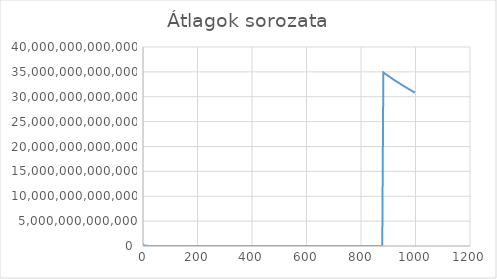
| Category | Series 0 |
|---|---|
| 1.0 | 19724846819.907 |
| 2.0 | 229930537430.604 |
| 3.0 | 153565868804.437 |
| 4.0 | 115174401613.328 |
| 5.0 | 92139521290.983 |
| 6.0 | 76782944685.442 |
| 7.0 | 65813952588.064 |
| 8.0 | 57587208521.358 |
| 9.0 | 51188629797.027 |
| 10.0 | 46069766818.082 |
| 11.0 | 41881607259.74 |
| 12.0 | 38391473335.248 |
| 13.0 | 35438283161.898 |
| 14.0 | 32906981036.695 |
| 15.0 | 30713182416.195 |
| 16.0 | 28794187320.283 |
| 17.0 | 27100411596.561 |
| 18.0 | 25594857300.366 |
| 19.0 | 24247759552.774 |
| 20.0 | 23035371575.427 |
| 21.0 | 21938449208.439 |
| 22.0 | 20941246972.965 |
| 23.0 | 20030758002.763 |
| 24.0 | 19196143098.01 |
| 25.0 | 18428297374.164 |
| 26.0 | 17719516705.983 |
| 27.0 | 17063238620.04 |
| 28.0 | 16453837242.734 |
| 29.0 | 15886463544.755 |
| 30.0 | 15356914764.224 |
| 31.0 | 14861530538.324 |
| 32.0 | 14397107709.798 |
| 33.0 | 13960875382.173 |
| 34.0 | 13550261410.743 |
| 35.0 | 13163111659.04 |
| 36.0 | 12797469668.547 |
| 37.0 | 12451592110.085 |
| 38.0 | 12123918633.544 |
| 39.0 | 11813048925.401 |
| 40.0 | 11517723842.822 |
| 41.0 | 11236803749.482 |
| 42.0 | 10969260803.286 |
| 43.0 | 10714161714.869 |
| 44.0 | 10470658160.061 |
| 45.0 | 10237976868.073 |
| 46.0 | 10015412171.199 |
| 47.0 | 9802318295.325 |
| 48.0 | 9598103330.966 |
| 49.0 | 9402223671.187 |
| 50.0 | 9216576213.076 |
| 51.0 | 9035859033.383 |
| 52.0 | 8862092516.917 |
| 53.0 | 8694883226.015 |
| 54.0 | 8533866870.097 |
| 55.0 | 8378705661.365 |
| 56.0 | 8229085917.439 |
| 57.0 | 8084716124.878 |
| 58.0 | 7945324467.596 |
| 59.0 | 7810657952.505 |
| 60.0 | 7680480320.06 |
| 61.0 | 7554570808.469 |
| 62.0 | 7432722892.471 |
| 63.0 | 7314743165.586 |
| 64.0 | 7200450303.652 |
| 65.0 | 7089674145.155 |
| 66.0 | 6982255321.059 |
| 67.0 | 6878042555.107 |
| 68.0 | 6776894877.341 |
| 69.0 | 6678679009.64 |
| 70.0 | 6583269309.573 |
| 71.0 | 6490547207.248 |
| 72.0 | 6400400718.279 |
| 73.0 | 6312723996.131 |
| 74.0 | 6227416917.142 |
| 75.0 | 6144384691.624 |
| 76.0 | 6063750202.091 |
| 77.0 | 5985000200.344 |
| 78.0 | 5908269471.07 |
| 79.0 | 5833481249.947 |
| 80.0 | 5760562734.355 |
| 81.0 | 5691732467.257 |
| 82.0 | 5622331978.803 |
| 83.0 | 5554593039.332 |
| 84.0 | 5488466935.043 |
| 85.0 | 5423896735.823 |
| 86.0 | 5360849330.842 |
| 87.0 | 5299230373.317 |
| 88.0 | 5239011850.4 |
| 89.0 | 5180148224.68 |
| 90.0 | 5122591152.175 |
| 91.0 | 5066298944.329 |
| 92.0 | 5011230477.655 |
| 93.0 | 4957346278.982 |
| 94.0 | 4904608552.701 |
| 95.0 | 4852982028.098 |
| 96.0 | 4802438501.838 |
| 97.0 | 4752928826.655 |
| 98.0 | 4704429555.519 |
| 99.0 | 4656910065.316 |
| 100.0 | 4610340964.787 |
| 101.0 | 4564694024.573 |
| 102.0 | 4519942125.119 |
| 103.0 | 4476059277.794 |
| 104.0 | 4433096106.19 |
| 105.0 | 4390876143.321 |
| 106.0 | 4349452783.594 |
| 107.0 | 4308803692.174 |
| 108.0 | 4268907361.705 |
| 109.0 | 4229743082.653 |
| 110.0 | 4191290895.528 |
| 111.0 | 4153577433.517 |
| 112.0 | 4116491955.772 |
| 113.0 | 4080062823.588 |
| 114.0 | 4044272798.852 |
| 115.0 | 4009105210.274 |
| 116.0 | 3974543958.528 |
| 117.0 | 3940573497.397 |
| 118.0 | 3907178808.82 |
| 119.0 | 3874345373.477 |
| 120.0 | 3842059162.263 |
| 121.0 | 3810306607.286 |
| 122.0 | 3779074586.481 |
| 123.0 | 3748350403.057 |
| 124.0 | 3718121781.241 |
| 125.0 | 3688376807.257 |
| 126.0 | 3659103975.643 |
| 127.0 | 3630292136.177 |
| 128.0 | 3601930478.9 |
| 129.0 | 3574008537.272 |
| 130.0 | 3546516164.117 |
| 131.0 | 3519443521.792 |
| 132.0 | 3492781070.894 |
| 133.0 | 3466519559.325 |
| 134.0 | 3440650845.348 |
| 135.0 | 3415164542.829 |
| 136.0 | 3390053039.271 |
| 137.0 | 3365308362.324 |
| 138.0 | 3341114537.451 |
| 139.0 | 3317077745.63 |
| 140.0 | 3516910248.244 |
| 141.0 | 3491967622.379 |
| 142.0 | 3467376301.104 |
| 143.0 | 3443129526.419 |
| 144.0 | 3419218904.719 |
| 145.0 | 3395638084.756 |
| 146.0 | 3372380290.044 |
| 147.0 | 3349438929.194 |
| 148.0 | 3326807597.508 |
| 149.0 | 3304480030.022 |
| 150.0 | 3282450163.18 |
| 151.0 | 3260712082.721 |
| 152.0 | 3239301927.737 |
| 153.0 | 3218130019.723 |
| 154.0 | 3197236311.782 |
| 155.0 | 3176608980.984 |
| 156.0 | 3156246103.031 |
| 157.0 | 3136142775.728 |
| 158.0 | 3116293771.032 |
| 159.0 | 3096694443.699 |
| 160.0 | 3077340103.442 |
| 161.0 | 3058226189.796 |
| 162.0 | 3039348250.423 |
| 163.0 | 3020738201.701 |
| 164.0 | 3002319066.334 |
| 165.0 | 2984123194.391 |
| 166.0 | 2966146548.661 |
| 167.0 | 2948385192.34 |
| 168.0 | 2930835310.667 |
| 169.0 | 2913495444.99 |
| 170.0 | 2896357236.594 |
| 171.0 | 2879419475.031 |
| 172.0 | 2862678664.136 |
| 173.0 | 2846131388.629 |
| 174.0 | 2829775571.065 |
| 175.0 | 2813605425.064 |
| 176.0 | 2797619031.166 |
| 177.0 | 2781813274.654 |
| 178.0 | 2766185175.168 |
| 179.0 | 2750731631.385 |
| 180.0 | 2735449789.041 |
| 181.0 | 2720337932.336 |
| 182.0 | 2705391022.521 |
| 183.0 | 2690607465.059 |
| 184.0 | 2675985899.465 |
| 185.0 | 2661521113.669 |
| 186.0 | 2647211860.414 |
| 187.0 | 2633055649.556 |
| 188.0 | 2619050034.404 |
| 189.0 | 2605192629.944 |
| 190.0 | 2591481089.796 |
| 191.0 | 2577913125.985 |
| 192.0 | 2564486495.127 |
| 193.0 | 2551199000.343 |
| 194.0 | 2538048491.9 |
| 195.0 | 2525253549.242 |
| 196.0 | 2512369605.198 |
| 197.0 | 2499616460.013 |
| 198.0 | 2486992134.488 |
| 199.0 | 2474494686.912 |
| 200.0 | 2462122213.482 |
| 201.0 | 2449872849.259 |
| 202.0 | 2437744765.911 |
| 203.0 | 2425736171.011 |
| 204.0 | 2413845311.473 |
| 205.0 | 2402070533.396 |
| 206.0 | 2390409997.044 |
| 207.0 | 2378862122.672 |
| 208.0 | 2367425288.873 |
| 209.0 | 2356097895.193 |
| 210.0 | 2344878381.463 |
| 211.0 | 2333765214.353 |
| 212.0 | 2322756887.943 |
| 213.0 | 2311851926.462 |
| 214.0 | 2301048881.47 |
| 215.0 | 2290346354.399 |
| 216.0 | 2279742899.109 |
| 217.0 | 2269237176.736 |
| 218.0 | 2258827838.164 |
| 219.0 | 2248513555.805 |
| 220.0 | 2238293039.814 |
| 221.0 | 2228165017.015 |
| 222.0 | 2218128237.707 |
| 223.0 | 2208181474.314 |
| 224.0 | 2198323521.311 |
| 225.0 | 2188553194.572 |
| 226.0 | 2178869330.891 |
| 227.0 | 2169270787.612 |
| 228.0 | 2159756451.711 |
| 229.0 | 2150325200.85 |
| 230.0 | 2140975960.859 |
| 231.0 | 2131707667.154 |
| 232.0 | 2122519272.088 |
| 233.0 | 2113409783.902 |
| 234.0 | 2104378118.185 |
| 235.0 | 2095423317.688 |
| 236.0 | 2086544405.413 |
| 237.0 | 2077740420.732 |
| 238.0 | 2069010418.969 |
| 239.0 | 2060353471.835 |
| 240.0 | 2051768665.714 |
| 241.0 | 2043255103.573 |
| 242.0 | 2034811900.671 |
| 243.0 | 2026438189.15 |
| 244.0 | 2018134318.277 |
| 245.0 | 2009897036.519 |
| 246.0 | 2001726723.604 |
| 247.0 | 1993622566.924 |
| 248.0 | 1985583766.256 |
| 249.0 | 1977609535.233 |
| 250.0 | 1969699097.148 |
| 251.0 | 1961851690.396 |
| 252.0 | 1954066564.67 |
| 253.0 | 1946342981.418 |
| 254.0 | 1938699261.75 |
| 255.0 | 1931096522.741 |
| 256.0 | 1923553187.091 |
| 257.0 | 1916070279.418 |
| 258.0 | 1908643650.433 |
| 259.0 | 1901274369.945 |
| 260.0 | 1893961860.176 |
| 261.0 | 1886705301.332 |
| 262.0 | 1879504136.152 |
| 263.0 | 1872358773.256 |
| 264.0 | 1865266505.203 |
| 265.0 | 1858227770.225 |
| 266.0 | 1851241951.638 |
| 267.0 | 1844308461.228 |
| 268.0 | 1837426713.457 |
| 269.0 | 1830596130.979 |
| 270.0 | 1823816145.327 |
| 271.0 | 1817086196.516 |
| 272.0 | 2086988729.327 |
| 273.0 | 2079344082.024 |
| 274.0 | 2071755235.365 |
| 275.0 | 2064221580.052 |
| 276.0 | 2056742516.475 |
| 277.0 | 2049317505.013 |
| 278.0 | 2041945859.342 |
| 279.0 | 2034627056.994 |
| 280.0 | 2027360531.811 |
| 281.0 | 2020145725.653 |
| 282.0 | 2012982088.368 |
| 283.0 | 2005869077.46 |
| 284.0 | 1998806158.192 |
| 285.0 | 1991792803.333 |
| 286.0 | 1984828492.846 |
| 287.0 | 1977912714.133 |
| 288.0 | 1971044964.958 |
| 289.0 | 1964224740.189 |
| 290.0 | 1957451553.116 |
| 291.0 | 1950724915.695 |
| 292.0 | 1944044350.92 |
| 293.0 | 19555310328.83 |
| 294.0 | 19488795669.929 |
| 295.0 | 19422731955.823 |
| 296.0 | 19357114618.183 |
| 297.0 | 19291939150.012 |
| 298.0 | 19227201099.921 |
| 299.0 | 19162896079.592 |
| 300.0 | 19099024267.638 |
| 301.0 | 19035572359.804 |
| 302.0 | 18972540663.252 |
| 303.0 | 18909925017.51 |
| 304.0 | 18847721316.798 |
| 305.0 | 18785925509.243 |
| 306.0 | 18724533999.526 |
| 307.0 | 18663542032.125 |
| 308.0 | 18603021089.715 |
| 309.0 | 18542817161.263 |
| 310.0 | 18483001622.103 |
| 311.0 | 18423570748.792 |
| 312.0 | 18364532230.419 |
| 313.0 | 18305859603.491 |
| 314.0 | 18247560687.563 |
| 315.0 | 18189631923.764 |
| 316.0 | 18132070117.846 |
| 317.0 | 18074871158.517 |
| 318.0 | 18018031941.052 |
| 319.0 | 17961549082.333 |
| 320.0 | 17905419241.457 |
| 321.0 | 17849639119.43 |
| 322.0 | 17794205459.597 |
| 323.0 | 17739115079.594 |
| 324.0 | 17684364724.547 |
| 325.0 | 17629951295.157 |
| 326.0 | 17575878628.903 |
| 327.0 | 17522129764.6 |
| 328.0 | 17468708637.402 |
| 329.0 | 17415615296.966 |
| 330.0 | 17362840706.688 |
| 331.0 | 17310384994.59 |
| 332.0 | 17258245359.566 |
| 333.0 | 17206418796.934 |
| 334.0 | 17154902573.147 |
| 335.0 | 17106297209.575 |
| 336.0 | 17055385610.833 |
| 337.0 | 17004776260.281 |
| 338.0 | 16954466271.35 |
| 339.0 | 16904453346.074 |
| 340.0 | 16854734365.663 |
| 341.0 | 16805306992.198 |
| 342.0 | 16756168667.663 |
| 343.0 | 16707316863.97 |
| 344.0 | 16658749082.704 |
| 345.0 | 16610464112.013 |
| 346.0 | 16562456990.314 |
| 347.0 | 16514726566.749 |
| 348.0 | 16467270455.929 |
| 349.0 | 16420086300.035 |
| 350.0 | 16373171767.778 |
| 351.0 | 16326524554.825 |
| 352.0 | 16280142383.065 |
| 353.0 | 16234022999.707 |
| 354.0 | 16188164177.694 |
| 355.0 | 16142563715.226 |
| 356.0 | 16097219435.133 |
| 357.0 | 16052129411.242 |
| 358.0 | 16007291147.459 |
| 359.0 | 15962702593.556 |
| 360.0 | 15918361760.14 |
| 361.0 | 15874281372.937 |
| 362.0 | 15830429766.947 |
| 363.0 | 15786819779.963 |
| 364.0 | 15743449396.873 |
| 365.0 | 15700316658.828 |
| 366.0 | 15657419618.985 |
| 367.0 | 15614756364.656 |
| 368.0 | 15572324963.866 |
| 369.0 | 15530123541.207 |
| 370.0 | 15488150234.344 |
| 371.0 | 15446403203.375 |
| 372.0 | 15404880615.051 |
| 373.0 | 15363580667.574 |
| 374.0 | 15322501952.479 |
| 375.0 | 15281646564.196 |
| 376.0 | 15241003887.168 |
| 377.0 | 15200576821.162 |
| 378.0 | 15160363655.004 |
| 379.0 | 15120362695.532 |
| 380.0 | 15080572267.393 |
| 381.0 | 15040990712.889 |
| 382.0 | 15001616391.683 |
| 383.0 | 14962447680.564 |
| 384.0 | 14923482973.069 |
| 385.0 | 14884720680.425 |
| 386.0 | 14846159227.93 |
| 387.0 | 14807797059.395 |
| 388.0 | 14769632633.988 |
| 389.0 | 14731664506.858 |
| 390.0 | 14693891010.978 |
| 391.0 | 14656310727.069 |
| 392.0 | 14618922179.381 |
| 393.0 | 14581723904.599 |
| 394.0 | 14544714453.358 |
| 395.0 | 14507892391.536 |
| 396.0 | 14471256299.68 |
| 397.0 | 14434804772.483 |
| 398.0 | 14398536420.692 |
| 399.0 | 14362449863.251 |
| 400.0 | 14326544207.03 |
| 401.0 | 14290817164.132 |
| 402.0 | 14255268051.955 |
| 403.0 | 14219895178.403 |
| 404.0 | 14184697418.078 |
| 405.0 | 14149770007.178 |
| 406.0 | 14114920319.176 |
| 407.0 | 14080239925.36 |
| 408.0 | 14045729552.792 |
| 409.0 | 14011387915.746 |
| 410.0 | 13977276010.178 |
| 411.0 | 13943268040.976 |
| 412.0 | 13909425157.387 |
| 413.0 | 13875746161.868 |
| 414.0 | 13842229866.818 |
| 415.0 | 13808875096.383 |
| 416.0 | 13775680685.097 |
| 417.0 | 13742645479.633 |
| 418.0 | 15560488876.191 |
| 419.0 | 15523351671.779 |
| 420.0 | 15486391312.003 |
| 421.0 | 15454145279.882 |
| 422.0 | 15417524082.551 |
| 423.0 | 15381076756.284 |
| 424.0 | 15344800640.47 |
| 425.0 | 15308695227.218 |
| 426.0 | 15272759323.459 |
| 427.0 | 15236991737.244 |
| 428.0 | 15201391289.275 |
| 429.0 | 15165956811.041 |
| 430.0 | 15130687243.088 |
| 431.0 | 15095581240.214 |
| 432.0 | 15060637765.125 |
| 433.0 | 15025855692.03 |
| 434.0 | 14991233906.486 |
| 435.0 | 14957082349.963 |
| 436.0 | 14948785650.013 |
| 437.0 | 14914577902.552 |
| 438.0 | 14880526354.934 |
| 439.0 | 14846629939.567 |
| 440.0 | 14812887599.189 |
| 441.0 | 14779298287.047 |
| 442.0 | 14745860960.618 |
| 443.0 | 14712574592.854 |
| 444.0 | 14679438163.593 |
| 445.0 | 14646450662.124 |
| 446.0 | 14613611087.91 |
| 447.0 | 14580918445.887 |
| 448.0 | 14548371989.73 |
| 449.0 | 14515970270.614 |
| 450.0 | 14483712558.91 |
| 451.0 | 14451597897.254 |
| 452.0 | 14419625338.867 |
| 453.0 | 14387793936.398 |
| 454.0 | 14356102761.137 |
| 455.0 | 14324550888.101 |
| 456.0 | 14293137399.66 |
| 457.0 | 14261861387.87 |
| 458.0 | 14230721952.587 |
| 459.0 | 14199718201.06 |
| 460.0 | 14168849248.452 |
| 461.0 | 14138114217.548 |
| 462.0 | 14107512238.725 |
| 463.0 | 14077042449.912 |
| 464.0 | 14046704044.193 |
| 465.0 | 14016496078.514 |
| 466.0 | 13986435945.469 |
| 467.0 | 13956486404.216 |
| 468.0 | 13926665008.63 |
| 469.0 | 13896970626.953 |
| 470.0 | 13867402604.346 |
| 471.0 | 13837960135.974 |
| 472.0 | 13808654354.128 |
| 473.0 | 13779460607.182 |
| 474.0 | 13750390015.186 |
| 475.0 | 13721441826.933 |
| 476.0 | 13692618285.633 |
| 477.0 | 13663912591.552 |
| 478.0 | 13635327001.123 |
| 479.0 | 13606986477.291 |
| 480.0 | 13578638588.803 |
| 481.0 | 13550408572.477 |
| 482.0 | 13522295691.625 |
| 483.0 | 13494299220.218 |
| 484.0 | 13466418436.72 |
| 485.0 | 13438652625.514 |
| 486.0 | 13411001079.458 |
| 487.0 | 13383463089.565 |
| 488.0 | 13356037960.285 |
| 489.0 | 13328725047.591 |
| 490.0 | 13301523568.056 |
| 491.0 | 13274432888.694 |
| 492.0 | 13247452334.055 |
| 493.0 | 13220581234.027 |
| 494.0 | 13193818923.889 |
| 495.0 | 13167164744.874 |
| 496.0 | 13140618041.767 |
| 497.0 | 13114178172.961 |
| 498.0 | 13087844481.854 |
| 499.0 | 13061616336.603 |
| 500.0 | 13035493104.389 |
| 501.0 | 13009474260.51 |
| 502.0 | 12983558973.143 |
| 503.0 | 12957746728.7 |
| 504.0 | 12932036913.774 |
| 505.0 | 12906428919.888 |
| 506.0 | 12880935490.646 |
| 507.0 | 12855529307.869 |
| 508.0 | 12830223148.382 |
| 509.0 | 12805016423.148 |
| 510.0 | 12779908547.825 |
| 511.0 | 12754898947.598 |
| 512.0 | 12729987054.153 |
| 513.0 | 12705173946.75 |
| 514.0 | 12680455709.885 |
| 515.0 | 12655833466.08 |
| 516.0 | 12631306657.043 |
| 517.0 | 12606874729.284 |
| 518.0 | 12582537133.346 |
| 519.0 | 12558293324.228 |
| 520.0 | 12534142760.145 |
| 521.0 | 12510084904.563 |
| 522.0 | 12486119225.426 |
| 523.0 | 12462245192.496 |
| 524.0 | 12438462281.919 |
| 525.0 | 12414775075.879 |
| 526.0 | 12391172841.971 |
| 527.0 | 12367660180.76 |
| 528.0 | 12344236581.935 |
| 529.0 | 12320901541.212 |
| 530.0 | 12297654557.207 |
| 531.0 | 12274497860.736 |
| 532.0 | 12251425498.784 |
| 533.0 | 12228439710.152 |
| 534.0 | 12205540010.324 |
| 535.0 | 12182725916.849 |
| 536.0 | 12159996950.763 |
| 537.0 | 12137352636.348 |
| 538.0 | 12114792513.452 |
| 539.0 | 12092316094.029 |
| 540.0 | 12069922959.82 |
| 541.0 | 12047612566.284 |
| 542.0 | 12025384498.85 |
| 543.0 | 12003280352.456 |
| 544.0 | 11981215510.074 |
| 545.0 | 11959231628.416 |
| 546.0 | 11937328273.825 |
| 547.0 | 11915506398.588 |
| 548.0 | 11893762787.76 |
| 549.0 | 11872098374.963 |
| 550.0 | 11850512840.801 |
| 551.0 | 11829005575.042 |
| 552.0 | 11807576217.121 |
| 553.0 | 11786224363.12 |
| 554.0 | 11764949589.908 |
| 555.0 | 11743751482.546 |
| 556.0 | 11722629627.381 |
| 557.0 | 11701583613.768 |
| 558.0 | 11729050303.293 |
| 559.0 | 11708068102.425 |
| 560.0 | 11687160842.163 |
| 561.0 | 11666328113.392 |
| 562.0 | 11645569522.528 |
| 563.0 | 11624884985.942 |
| 564.0 | 11604273487.811 |
| 565.0 | 11583734951.59 |
| 566.0 | 11563268988.782 |
| 567.0 | 11542875216.318 |
| 568.0 | 11522553253.048 |
| 569.0 | 11502302720.092 |
| 570.0 | 11482123254.08 |
| 571.0 | 11462014456.802 |
| 572.0 | 11441975969.995 |
| 573.0 | 11422007425.629 |
| 574.0 | 11402108458.613 |
| 575.0 | 11382278706.831 |
| 576.0 | 11362517808.376 |
| 577.0 | 11342825405.134 |
| 578.0 | 11323201139.731 |
| 579.0 | 11303644661.097 |
| 580.0 | 11284155656.618 |
| 581.0 | 11264733706.002 |
| 582.0 | 11245378493.461 |
| 583.0 | 11226089681.124 |
| 584.0 | 11206866925.326 |
| 585.0 | 11187709898.749 |
| 586.0 | 11168618253.115 |
| 587.0 | 11149591646.22 |
| 588.0 | 11130629755.699 |
| 589.0 | 11111732252.096 |
| 590.0 | 11092898807.61 |
| 591.0 | 11074129097.283 |
| 592.0 | 11170809240.436 |
| 593.0 | 11151971454.21 |
| 594.0 | 11133197091.932 |
| 595.0 | 11114485914.319 |
| 596.0 | 11095837448.066 |
| 597.0 | 11077251455.692 |
| 598.0 | 11058727623.831 |
| 599.0 | 11040340627.648 |
| 600.0 | 11021940059.963 |
| 601.0 | 11003600725.539 |
| 602.0 | 10985322319.021 |
| 603.0 | 10967104537.4 |
| 604.0 | 10948947079.564 |
| 605.0 | 10930849646.486 |
| 606.0 | 10912811940.94 |
| 607.0 | 10894833667.927 |
| 608.0 | 10876914533.618 |
| 609.0 | 10859054252.154 |
| 610.0 | 10841252523.905 |
| 611.0 | 10823509068.887 |
| 612.0 | 10805823596.566 |
| 613.0 | 10788195825.614 |
| 614.0 | 10770625487.048 |
| 615.0 | 10753112274.876 |
| 616.0 | 10735655930.575 |
| 617.0 | 10718256164.21 |
| 618.0 | 10700912707.672 |
| 619.0 | 10683625288.119 |
| 620.0 | 10666393634.475 |
| 621.0 | 10649217477.257 |
| 622.0 | 10632096549.767 |
| 623.0 | 10615030585.536 |
| 624.0 | 10598028958.25 |
| 625.0 | 10581072111.92 |
| 626.0 | 10564169440.817 |
| 627.0 | 10547320685.732 |
| 628.0 | 10530525589.186 |
| 629.0 | 10513783896.344 |
| 630.0 | 10497095350.485 |
| 631.0 | 10480459700.17 |
| 632.0 | 10463891233.041 |
| 633.0 | 10447360619.731 |
| 634.0 | 10430882133.026 |
| 635.0 | 10414455547.091 |
| 636.0 | 10398080616.988 |
| 637.0 | 10381757099.548 |
| 638.0 | 10365484753 |
| 639.0 | 10349263337.126 |
| 640.0 | 10333092613.245 |
| 641.0 | 10316972343.969 |
| 642.0 | 10300902293.592 |
| 643.0 | 10284882227.88 |
| 644.0 | 10268911913.875 |
| 645.0 | 10252991120.238 |
| 646.0 | 10237119618.578 |
| 647.0 | 10221297177.24 |
| 648.0 | 10205523572.15 |
| 649.0 | 10189799376.261 |
| 650.0 | 10174122761.977 |
| 651.0 | 10158494309.223 |
| 652.0 | 10142913796.717 |
| 653.0 | 10127381003.777 |
| 654.0 | 10111897378.039 |
| 655.0 | 10096459366.79 |
| 656.0 | 10081068422.914 |
| 657.0 | 10065724330.95 |
| 658.0 | 10050426878.411 |
| 659.0 | 10035175851.289 |
| 660.0 | 10019971039.407 |
| 661.0 | 10004812238.812 |
| 662.0 | 9989699229.391 |
| 663.0 | 9974631809.744 |
| 664.0 | 9959609773.892 |
| 665.0 | 9944632919.645 |
| 666.0 | 9929701040.316 |
| 667.0 | 9914813932.314 |
| 668.0 | 9899975207.837 |
| 669.0 | 9885177077.612 |
| 670.0 | 9870423082.005 |
| 671.0 | 9855713062.634 |
| 672.0 | 9841046823.011 |
| 673.0 | 9826424168.003 |
| 674.0 | 9811844903.983 |
| 675.0 | 9797308837.464 |
| 676.0 | 9782815777.249 |
| 677.0 | 9768366244.621 |
| 678.0 | 9754196050.517 |
| 679.0 | 9739830518.79 |
| 680.0 | 9725507238.663 |
| 681.0 | 9711226023.952 |
| 682.0 | 9696986700.728 |
| 683.0 | 9682801054.478 |
| 684.0 | 9668644915.076 |
| 685.0 | 9654530104.984 |
| 686.0 | 9640456445.952 |
| 687.0 | 9626423758.261 |
| 688.0 | 9612431863.338 |
| 689.0 | 9598480583.437 |
| 690.0 | 9584569742.017 |
| 691.0 | 9570699166.158 |
| 692.0 | 9556868676.197 |
| 693.0 | 9543078100.923 |
| 694.0 | 9529327268.506 |
| 695.0 | 9515616439.721 |
| 696.0 | 9501944577.093 |
| 697.0 | 9488311945.208 |
| 698.0 | 9474718385.02 |
| 699.0 | 9461163710.019 |
| 700.0 | 9447652751.83 |
| 701.0 | 9434175358.524 |
| 702.0 | 9420736362.289 |
| 703.0 | 9407335790.663 |
| 704.0 | 9393973097.895 |
| 705.0 | 9380648319.452 |
| 706.0 | 9367361282.243 |
| 707.0 | 9354111832.573 |
| 708.0 | 9340899810.428 |
| 709.0 | 9327725057.524 |
| 710.0 | 9314587416.603 |
| 711.0 | 9301486731.074 |
| 712.0 | 9288422845.429 |
| 713.0 | 9275395604.417 |
| 714.0 | 9262404854.658 |
| 715.0 | 9249450473.622 |
| 716.0 | 9236532247.132 |
| 717.0 | 9223650063.95 |
| 718.0 | 9210803784.161 |
| 719.0 | 9243662614.695 |
| 720.0 | 9230824289.585 |
| 721.0 | 9218021483.915 |
| 722.0 | 9205254141.141 |
| 723.0 | 9192522116.064 |
| 724.0 | 9179825262.314 |
| 725.0 | 9167163459.541 |
| 726.0 | 9154536512.633 |
| 727.0 | 9141944302.894 |
| 728.0 | 9129386687.096 |
| 729.0 | 9116863522.92 |
| 730.0 | 9104374668.784 |
| 731.0 | 9091919983.876 |
| 732.0 | 9079555707.098 |
| 733.0 | 9067168864.398 |
| 734.0 | 9054815773.304 |
| 735.0 | 9042496324.919 |
| 736.0 | 9030210324.601 |
| 737.0 | 9017957919.037 |
| 738.0 | 9005738463.912 |
| 739.0 | 8993552079.477 |
| 740.0 | 8981398631.003 |
| 741.0 | 8969860462.258 |
| 742.0 | 8957771701.529 |
| 743.0 | 8945715482.03 |
| 744.0 | 8933691670.9 |
| 745.0 | 8921700139.861 |
| 746.0 | 8909740756.3 |
| 747.0 | 8897813392.612 |
| 748.0 | 8885917920.179 |
| 749.0 | 8874054211.373 |
| 750.0 | 8862222139.119 |
| 751.0 | 8850421577.064 |
| 752.0 | 8838652402.293 |
| 753.0 | 8826914484.104 |
| 754.0 | 8815207700.97 |
| 755.0 | 8803531929.254 |
| 756.0 | 8791887045.753 |
| 757.0 | 8780272936.207 |
| 758.0 | 8768689462.678 |
| 759.0 | 8757136512.17 |
| 760.0 | 8745613964.434 |
| 761.0 | 8734121699.452 |
| 762.0 | 8722659868.788 |
| 763.0 | 8711227811.296 |
| 764.0 | 8699825680.657 |
| 765.0 | 8688453363.476 |
| 766.0 | 8677110735.182 |
| 767.0 | 8665797683.379 |
| 768.0 | 8654514092.666 |
| 769.0 | 8643259848.074 |
| 770.0 | 8632034890.056 |
| 771.0 | 8620838996.408 |
| 772.0 | 8620806150.332 |
| 773.0 | 8609653749.12 |
| 774.0 | 8598530166.123 |
| 775.0 | 8587435290.917 |
| 776.0 | 8576369008.327 |
| 777.0 | 8565331210.442 |
| 778.0 | 8554321808.611 |
| 779.0 | 8543340650.988 |
| 780.0 | 8532387650.208 |
| 781.0 | 8521462698.033 |
| 782.0 | 8510565687.543 |
| 783.0 | 8499696510.754 |
| 784.0 | 8488855413.851 |
| 785.0 | 8478041585.301 |
| 786.0 | 8467255272.853 |
| 787.0 | 8456496371.623 |
| 788.0 | 8445764777.256 |
| 789.0 | 8435060385.907 |
| 790.0 | 8424383094.284 |
| 791.0 | 8413732799.665 |
| 792.0 | 8403109399.684 |
| 793.0 | 8392512792.626 |
| 794.0 | 8381942877.274 |
| 795.0 | 8371399553.204 |
| 796.0 | 8360882719.596 |
| 797.0 | 8350392277.585 |
| 798.0 | 8339928131.325 |
| 799.0 | 8329490173.836 |
| 800.0 | 8319078313.226 |
| 801.0 | 8308692447.668 |
| 802.0 | 8298332486.533 |
| 803.0 | 8287998324.078 |
| 804.0 | 8277689889.01 |
| 805.0 | 8267407044.448 |
| 806.0 | 8257149719.074 |
| 807.0 | 8246917811.122 |
| 808.0 | 8236711229.68 |
| 809.0 | 8226529882.443 |
| 810.0 | 8216373672.714 |
| 811.0 | 8206242509.124 |
| 812.0 | 8196136299.147 |
| 813.0 | 8186054950.687 |
| 814.0 | 8175998372.246 |
| 815.0 | 8165966472.407 |
| 816.0 | 8155959160.81 |
| 817.0 | 8145976346.661 |
| 818.0 | 8136017940.412 |
| 819.0 | 8126083852.838 |
| 820.0 | 8116173994.485 |
| 821.0 | 8106288277.944 |
| 822.0 | 8096426613.41 |
| 823.0 | 8086588914.004 |
| 824.0 | 8076775092.879 |
| 825.0 | 8066985081.561 |
| 826.0 | 8057218755.804 |
| 827.0 | 8047476048.733 |
| 828.0 | 8037756874.846 |
| 829.0 | 8028061148.826 |
| 830.0 | 8018391546.904 |
| 831.0 | 8008742572.982 |
| 832.0 | 7999132155.573 |
| 833.0 | 7989529355.868 |
| 834.0 | 7979949584.462 |
| 835.0 | 7970392758.619 |
| 836.0 | 7960858796.926 |
| 837.0 | 7951347615.569 |
| 838.0 | 7941859134.207 |
| 839.0 | 7932393398.76 |
| 840.0 | 7922950073.287 |
| 841.0 | 7913529205.187 |
| 842.0 | 7904130714.447 |
| 843.0 | 7894754521.458 |
| 844.0 | 7885400562.896 |
| 845.0 | 7876068727.911 |
| 846.0 | 7866758956.282 |
| 847.0 | 7857471165.309 |
| 848.0 | 7848205407.519 |
| 849.0 | 7838961350.749 |
| 850.0 | 7829739043.283 |
| 851.0 | 7820538413.206 |
| 852.0 | 7811359377.892 |
| 853.0 | 7802206066.506 |
| 854.0 | 7793069993.864 |
| 855.0 | 7783955292.132 |
| 856.0 | 7774861887.651 |
| 857.0 | 7765789703.428 |
| 858.0 | 7756738668.735 |
| 859.0 | 7747708705.228 |
| 860.0 | 7738701052.003 |
| 861.0 | 7729713013.701 |
| 862.0 | 7720745829.321 |
| 863.0 | 7711799426.445 |
| 864.0 | 7702873734.771 |
| 865.0 | 7693968689.165 |
| 866.0 | 7685084198.763 |
| 867.0 | 7676220203.15 |
| 868.0 | 7667376631.51 |
| 869.0 | 7658553413.3 |
| 870.0 | 7649750478.345 |
| 871.0 | 7643083649.055 |
| 872.0 | 7634318644.919 |
| 873.0 | 7625573720.932 |
| 874.0 | 7616848809.772 |
| 875.0 | 7608143841.508 |
| 876.0 | 7599458745.808 |
| 877.0 | 7590793459.957 |
| 878.0 | 7582147909.326 |
| 879.0 | 7573522030.487 |
| 880.0 | 7564915755.493 |
| 881.0 | 7556329017.979 |
| 882.0 | 34879236899544.94 |
| 883.0 | 34839736065004.133 |
| 884.0 | 34800324598867.254 |
| 885.0 | 34761002242955.445 |
| 886.0 | 34721768606113.2 |
| 887.0 | 34682623432938.656 |
| 888.0 | 34643566424568.24 |
| 889.0 | 34604597285481.72 |
| 890.0 | 34565715715508.742 |
| 891.0 | 34526921421776.543 |
| 892.0 | 34488214110765.63 |
| 893.0 | 34449593490260.965 |
| 894.0 | 34411059269354.637 |
| 895.0 | 34372611158439.164 |
| 896.0 | 34334248869200.223 |
| 897.0 | 34295972114608.188 |
| 898.0 | 34257780608912.98 |
| 899.0 | 34219674067635.008 |
| 900.0 | 34181652207563.586 |
| 901.0 | 34143714746733.9 |
| 902.0 | 34105862324866.61 |
| 903.0 | 34068092820631.426 |
| 904.0 | 34030406877247.543 |
| 905.0 | 33992804217714.95 |
| 906.0 | 33955284566260.53 |
| 907.0 | 33917847648327.29 |
| 908.0 | 33880493190564.9 |
| 909.0 | 33843220920828.316 |
| 910.0 | 33806030568245.574 |
| 911.0 | 33768921862901.727 |
| 912.0 | 33731894536789.64 |
| 913.0 | 33694948321524.81 |
| 914.0 | 33658082951370.484 |
| 915.0 | 33621298161259.703 |
| 916.0 | 33584593687299.914 |
| 917.0 | 33547969266707.742 |
| 918.0 | 33511425837249.375 |
| 919.0 | 33474960738406.062 |
| 920.0 | 33438574911516.496 |
| 921.0 | 33402268098366.14 |
| 922.0 | 33366040041860.33 |
| 923.0 | 33329890486018.715 |
| 924.0 | 33293819175968.92 |
| 925.0 | 33257825857940.855 |
| 926.0 | 33221910279261.207 |
| 927.0 | 33186072188345.117 |
| 928.0 | 33150311334693.95 |
| 929.0 | 33114627468888.176 |
| 930.0 | 33079020342578.16 |
| 931.0 | 33043489708483.47 |
| 932.0 | 33008035320425.957 |
| 933.0 | 32972656933158.625 |
| 934.0 | 32937354302611.6 |
| 935.0 | 32902127185711.19 |
| 936.0 | 32866975729761.42 |
| 937.0 | 32831898914681.64 |
| 938.0 | 32796896890254.605 |
| 939.0 | 32761969417528.03 |
| 940.0 | 32727116279627.4 |
| 941.0 | 32692337198165 |
| 942.0 | 32657631957024.773 |
| 943.0 | 32623000321863.562 |
| 944.0 | 32588442058810.934 |
| 945.0 | 32553956934939.312 |
| 946.0 | 32519544718319.22 |
| 947.0 | 32485205177961.97 |
| 948.0 | 32450938083892.387 |
| 949.0 | 32416743207091.703 |
| 950.0 | 32382620319505.312 |
| 951.0 | 32348569194037.906 |
| 952.0 | 32314589604551.848 |
| 953.0 | 32280681326087.29 |
| 954.0 | 32246844133923.176 |
| 955.0 | 32213077804987.133 |
| 956.0 | 32179382116906.605 |
| 957.0 | 32145756848237.305 |
| 958.0 | 32112201778458.355 |
| 959.0 | 32078716687969.9 |
| 960.0 | 32045301358086.605 |
| 961.0 | 32011955571033.45 |
| 962.0 | 31978679109941.094 |
| 963.0 | 31945471759329.938 |
| 964.0 | 31912333303148.06 |
| 965.0 | 31879263527704.66 |
| 966.0 | 31846262219704.97 |
| 967.0 | 31813329166737.332 |
| 968.0 | 31780464157268.414 |
| 969.0 | 31747666980635.605 |
| 970.0 | 31714937427047.33 |
| 971.0 | 31682275287575.605 |
| 972.0 | 31649680354152.188 |
| 973.0 | 31617152419564.16 |
| 974.0 | 31584691277449.633 |
| 975.0 | 31552296722512.453 |
| 976.0 | 31519968552432.695 |
| 977.0 | 31487706558008.527 |
| 978.0 | 31455510539033.09 |
| 979.0 | 31423380293334.46 |
| 980.0 | 31391315619565.754 |
| 981.0 | 31359316317201.266 |
| 982.0 | 31327382186532.758 |
| 983.0 | 31295513028662.43 |
| 984.0 | 31263708645503.223 |
| 985.0 | 31231968839771.758 |
| 986.0 | 31200293416259.707 |
| 987.0 | 31168682176729.605 |
| 988.0 | 31137134927578.523 |
| 989.0 | 31105651474668.97 |
| 990.0 | 31074231624694.56 |
| 991.0 | 31042875185122.57 |
| 992.0 | 31011581964169.832 |
| 993.0 | 30980351770852.457 |
| 994.0 | 30949184414946.168 |
| 995.0 | 30918079711141.793 |
| 996.0 | 30887037462435.84 |
| 997.0 | 30856057485041.234 |
| 998.0 | 30825139591769.746 |
| 999.0 | 30794283681499.367 |
| 1000.0 | 30763489397817.88 |